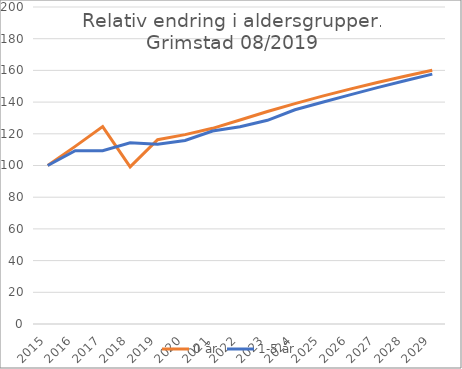
| Category | 0 år | 1-5 år |
|---|---|---|
| 2015.0 | 100 | 100 |
| 2016.0 | 112.069 | 109.355 |
| 2017.0 | 124.569 | 109.277 |
| 2018.0 | 99.138 | 114.387 |
| 2019.0 | 116.293 | 113.411 |
| 2020.0 | 119.48 | 115.753 |
| 2021.0 | 123.452 | 121.75 |
| 2022.0 | 128.672 | 124.43 |
| 2023.0 | 134.034 | 128.52 |
| 2024.0 | 139.066 | 135.188 |
| 2025.0 | 143.762 | 139.932 |
| 2026.0 | 148.191 | 144.576 |
| 2027.0 | 152.403 | 149.111 |
| 2028.0 | 156.353 | 153.482 |
| 2029.0 | 160.148 | 157.641 |